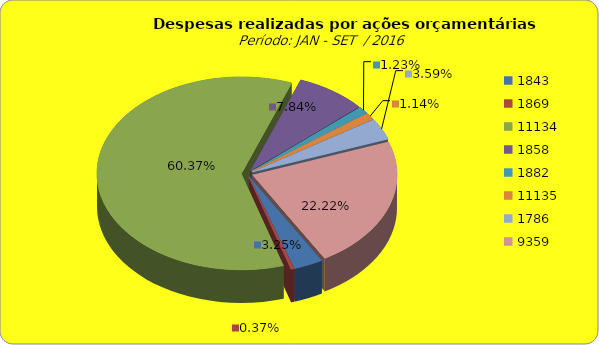
| Category | Series 1 |
|---|---|
| 1843.0 | 5958175.15 |
| 1869.0 | 675911.66 |
| 11134.0 | 110823996.54 |
| 1858.0 | 14400292.69 |
| 1882.0 | 2250338.92 |
| 11135.0 | 2090817.06 |
| 1786.0 | 6586167.4 |
| 9359.0 | 40798663.61 |